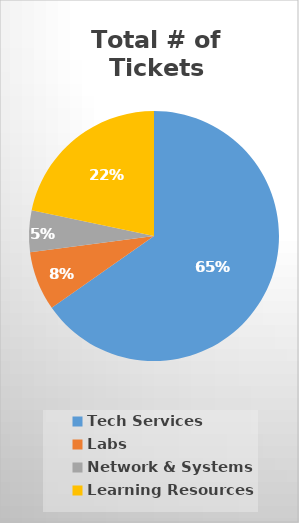
| Category | Series 0 |
|---|---|
| Tech Services | 0.653 |
| Labs | 0.077 |
| Network & Systems | 0.054 |
| Learning Resources | 0.217 |